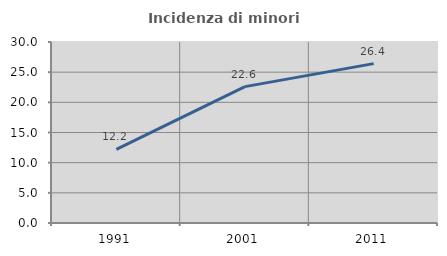
| Category | Incidenza di minori stranieri |
|---|---|
| 1991.0 | 12.195 |
| 2001.0 | 22.607 |
| 2011.0 | 26.415 |